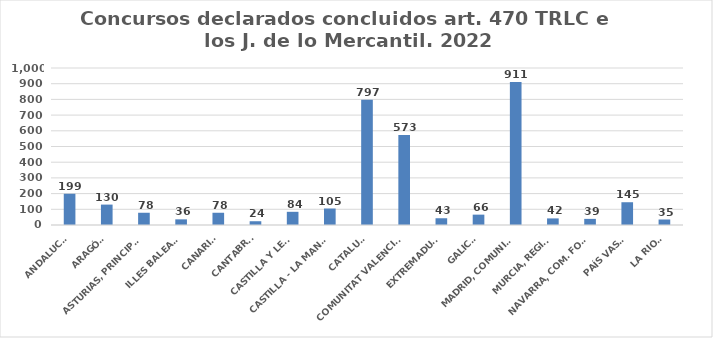
| Category | Series 0 |
|---|---|
| ANDALUCÍA | 199 |
| ARAGÓN | 130 |
| ASTURIAS, PRINCIPADO | 78 |
| ILLES BALEARS | 36 |
| CANARIAS | 78 |
| CANTABRIA | 24 |
| CASTILLA Y LEÓN | 84 |
| CASTILLA - LA MANCHA | 105 |
| CATALUÑA | 797 |
| COMUNITAT VALENCIANA | 573 |
| EXTREMADURA | 43 |
| GALICIA | 66 |
| MADRID, COMUNIDAD | 911 |
| MURCIA, REGIÓN | 42 |
| NAVARRA, COM. FORAL | 39 |
| PAÍS VASCO | 145 |
| LA RIOJA | 35 |